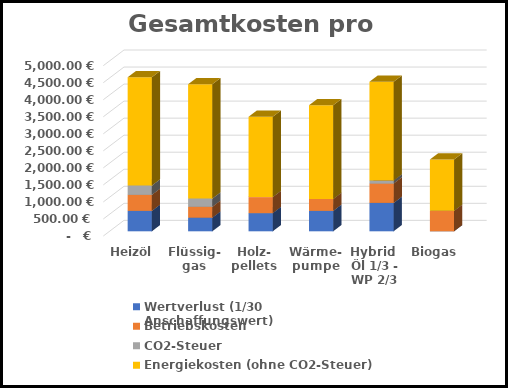
| Category | Wertverlust (1/30 Anschaffungswert) | Betriebskosten | CO2-Steuer | Energiekosten (ohne CO2-Steuer) |
|---|---|---|---|---|
| Heizöl | 600 | 470 | 271.429 | 3180.272 |
| Flüssig-
gas | 400 | 320 | 240.087 | 3354.963 |
| Holz-
pellets | 533.333 | 470 | 0 | 2361.111 |
| Wärme-
pumpe | 600 | 350 | 0 | 2751.429 |
| Hybrid 
Öl 1/3 - WP 2/3 | 833.333 | 570 | 90.476 | 2894.376 |
| Biogas | 0 | 604 | 0 | 1500 |